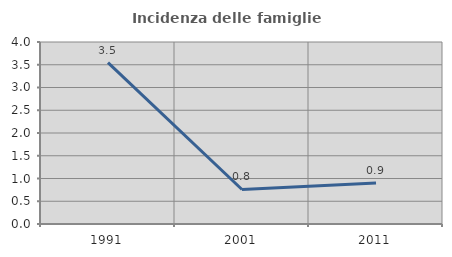
| Category | Incidenza delle famiglie numerose |
|---|---|
| 1991.0 | 3.548 |
| 2001.0 | 0.759 |
| 2011.0 | 0.9 |